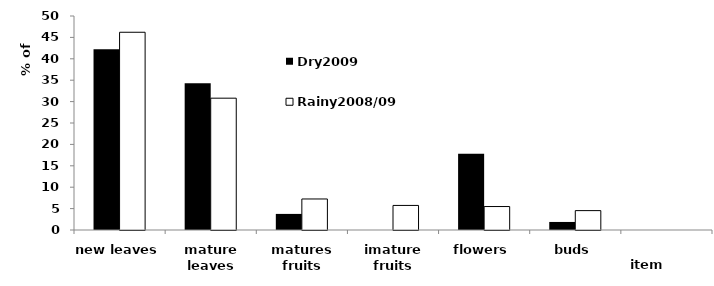
| Category | Dry2009 | Rainy2008/09 |
|---|---|---|
| new leaves | 42.25 | 46.2 |
| mature leaves | 34.27 | 30.8 |
| matures fruits | 3.76 | 7.25 |
| imature fruits | 0 | 5.74 |
| flowers | 17.84 | 5.48 |
| buds | 1.88 | 4.53 |